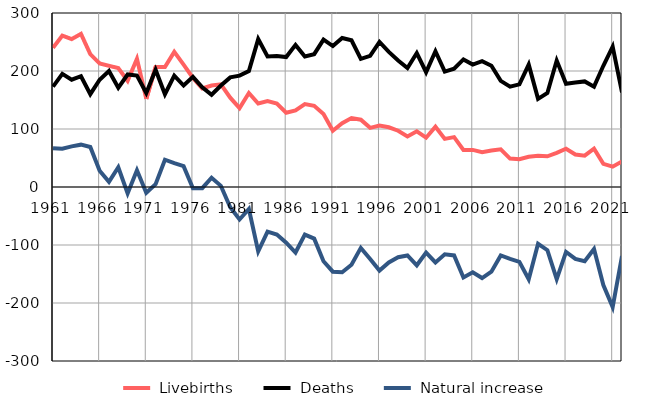
| Category |  Livebirths |  Deaths |  Natural increase |
|---|---|---|---|
| 1961.0 | 240 | 173 | 67 |
| 1962.0 | 261 | 195 | 66 |
| 1963.0 | 255 | 185 | 70 |
| 1964.0 | 264 | 191 | 73 |
| 1965.0 | 229 | 160 | 69 |
| 1966.0 | 213 | 185 | 28 |
| 1967.0 | 209 | 200 | 9 |
| 1968.0 | 205 | 171 | 34 |
| 1969.0 | 183 | 194 | -11 |
| 1970.0 | 221 | 192 | 29 |
| 1971.0 | 152 | 162 | -10 |
| 1972.0 | 207 | 202 | 5 |
| 1973.0 | 207 | 160 | 47 |
| 1974.0 | 233 | 192 | 41 |
| 1975.0 | 211 | 175 | 36 |
| 1976.0 | 188 | 190 | -2 |
| 1977.0 | 170 | 172 | -2 |
| 1978.0 | 175 | 159 | 16 |
| 1979.0 | 177 | 175 | 2 |
| 1980.0 | 154 | 189 | -35 |
| 1981.0 | 136 | 192 | -56 |
| 1982.0 | 162 | 200 | -38 |
| 1983.0 | 144 | 255 | -111 |
| 1984.0 | 148 | 225 | -77 |
| 1985.0 | 144 | 226 | -82 |
| 1986.0 | 128 | 224 | -96 |
| 1987.0 | 132 | 245 | -113 |
| 1988.0 | 143 | 225 | -82 |
| 1989.0 | 140 | 229 | -89 |
| 1990.0 | 126 | 254 | -128 |
| 1991.0 | 97 | 243 | -146 |
| 1992.0 | 110 | 257 | -147 |
| 1993.0 | 119 | 253 | -134 |
| 1994.0 | 116 | 221 | -105 |
| 1995.0 | 102 | 226 | -124 |
| 1996.0 | 106 | 250 | -144 |
| 1997.0 | 103 | 233 | -130 |
| 1998.0 | 97 | 218 | -121 |
| 1999.0 | 87 | 205 | -118 |
| 2000.0 | 96 | 231 | -135 |
| 2001.0 | 85 | 198 | -113 |
| 2002.0 | 104 | 234 | -130 |
| 2003.0 | 83 | 199 | -116 |
| 2004.0 | 86 | 204 | -118 |
| 2005.0 | 64 | 220 | -156 |
| 2006.0 | 64 | 211 | -147 |
| 2007.0 | 60 | 217 | -157 |
| 2008.0 | 63 | 209 | -146 |
| 2009.0 | 65 | 183 | -118 |
| 2010.0 | 49 | 173 | -124 |
| 2011.0 | 48 | 177 | -129 |
| 2012.0 | 52 | 211 | -159 |
| 2013.0 | 54 | 152 | -98 |
| 2014.0 | 53 | 162 | -109 |
| 2015.0 | 59 | 218 | -159 |
| 2016.0 | 66 | 178 | -112 |
| 2017.0 | 56 | 180 | -124 |
| 2018.0 | 54 | 182 | -128 |
| 2019.0 | 66 | 173 | -107 |
| 2020.0 | 40 | 209 | -169 |
| 2021.0 | 35 | 242 | -207 |
| 2022.0 | 44 | 163 | -119 |